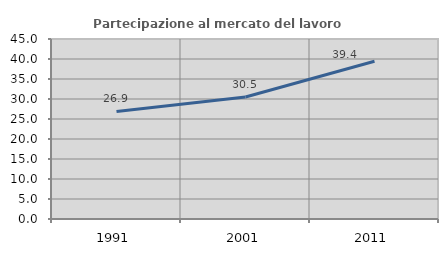
| Category | Partecipazione al mercato del lavoro  femminile |
|---|---|
| 1991.0 | 26.901 |
| 2001.0 | 30.508 |
| 2011.0 | 39.433 |